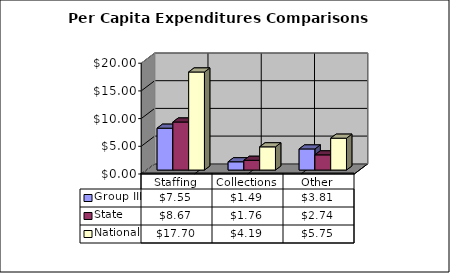
| Category | Group III | State | National |
|---|---|---|---|
| Staffing | 7.554 | 8.673 | 17.7 |
| Collections | 1.492 | 1.759 | 4.19 |
| Other | 3.811 | 2.74 | 5.75 |